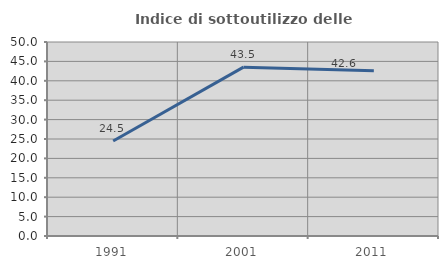
| Category | Indice di sottoutilizzo delle abitazioni  |
|---|---|
| 1991.0 | 24.487 |
| 2001.0 | 43.517 |
| 2011.0 | 42.586 |